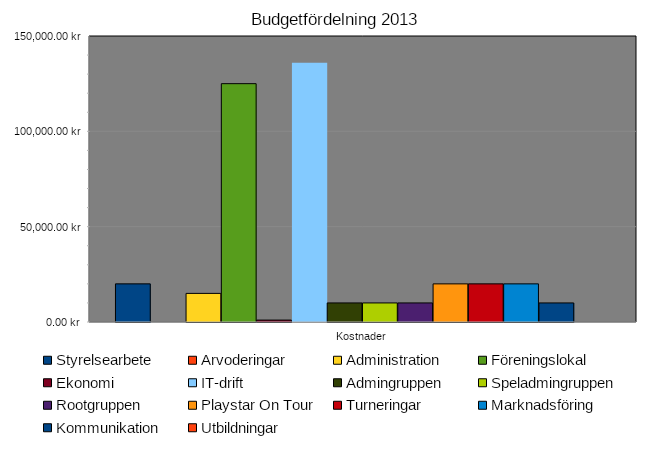
| Category | Styrelsearbete | Arvoderingar | Administration | Föreningslokal | Ekonomi | IT-drift | Admingruppen | Speladmingruppen | Rootgruppen | Playstar On Tour | Turneringar | Marknadsföring | Kommunikation | Utbildningar |
|---|---|---|---|---|---|---|---|---|---|---|---|---|---|---|
| Kostnader | 20000 | 0 | 15000 | 125000 | 1000 | 136000 | 10000 | 10000 | 10000 | 20000 | 20000 | 20000 | 10000 | 0 |